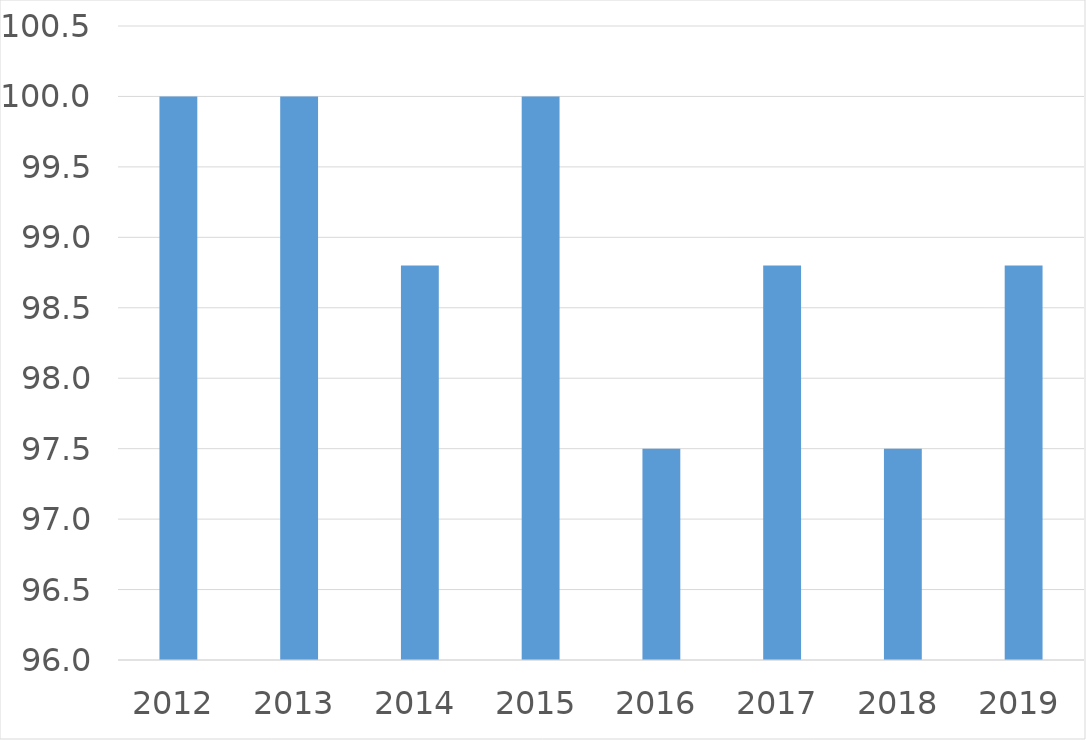
| Category | Series 0 |
|---|---|
| 2012 | 100 |
| 2013 | 100 |
| 2014 | 98.8 |
| 2015 | 100 |
| 2016 | 97.5 |
| 2017 | 98.8 |
| 2018 | 97.5 |
| 2019 | 98.8 |